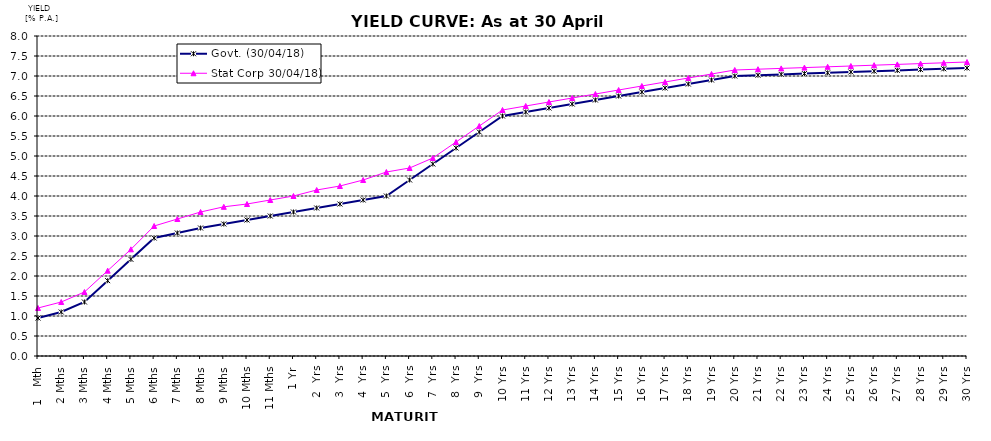
| Category | Govt. (30/04/18) | Stat Corp 30/04/18) |
|---|---|---|
| 1   Mth | 0.95 | 1.2 |
| 2 Mths | 1.1 | 1.35 |
| 3 Mths | 1.35 | 1.6 |
| 4 Mths | 1.883 | 2.133 |
| 5 Mths | 2.417 | 2.667 |
| 6 Mths | 2.95 | 3.25 |
| 7 Mths | 3.075 | 3.425 |
| 8 Mths | 3.2 | 3.6 |
| 9 Mths | 3.3 | 3.73 |
| 10 Mths | 3.4 | 3.8 |
| 11 Mths | 3.5 | 3.9 |
| 1 Yr | 3.6 | 4 |
| 2  Yrs | 3.7 | 4.15 |
| 3  Yrs | 3.8 | 4.25 |
| 4  Yrs | 3.9 | 4.4 |
| 5  Yrs | 4 | 4.6 |
| 6  Yrs | 4.4 | 4.7 |
| 7  Yrs | 4.8 | 4.95 |
| 8  Yrs | 5.2 | 5.35 |
| 9  Yrs | 5.6 | 5.75 |
| 10 Yrs | 6 | 6.15 |
| 11 Yrs | 6.1 | 6.25 |
| 12 Yrs | 6.2 | 6.35 |
| 13 Yrs | 6.3 | 6.45 |
| 14 Yrs | 6.4 | 6.55 |
| 15 Yrs | 6.5 | 6.65 |
| 16 Yrs | 6.6 | 6.75 |
| 17 Yrs | 6.7 | 6.85 |
| 18 Yrs | 6.8 | 6.95 |
| 19 Yrs | 6.9 | 7.05 |
| 20 Yrs | 7 | 7.15 |
| 21 Yrs | 7.02 | 7.17 |
| 22 Yrs | 7.04 | 7.19 |
| 23 Yrs | 7.06 | 7.21 |
| 24 Yrs | 7.08 | 7.23 |
| 25 Yrs | 7.1 | 7.25 |
| 26 Yrs | 7.12 | 7.27 |
| 27 Yrs | 7.14 | 7.29 |
| 28 Yrs | 7.16 | 7.31 |
| 29 Yrs | 7.18 | 7.33 |
| 30 Yrs | 7.2 | 7.35 |